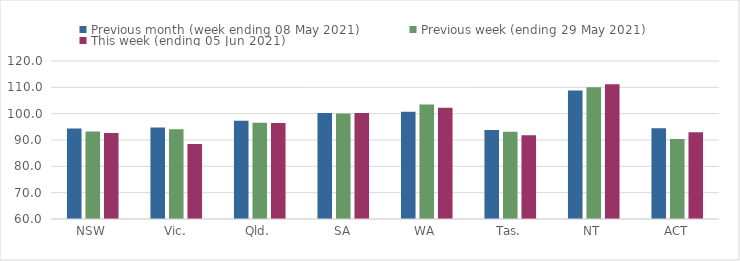
| Category | Previous month (week ending 08 May 2021) | Previous week (ending 29 May 2021) | This week (ending 05 Jun 2021) |
|---|---|---|---|
| NSW | 94.32 | 93.27 | 92.62 |
| Vic. | 94.7 | 94.09 | 88.52 |
| Qld. | 97.27 | 96.59 | 96.45 |
| SA | 100.26 | 100.04 | 100.28 |
| WA | 100.74 | 103.51 | 102.21 |
| Tas. | 93.8 | 93.18 | 91.81 |
| NT | 108.81 | 110.03 | 111.21 |
| ACT | 94.43 | 90.37 | 92.92 |